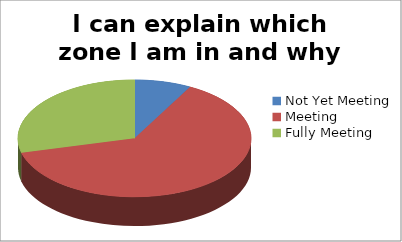
| Category | I can explain which zone I am in and why |
|---|---|
| Not Yet Meeting | 3 |
| Meeting | 24 |
| Fully Meeting | 11 |